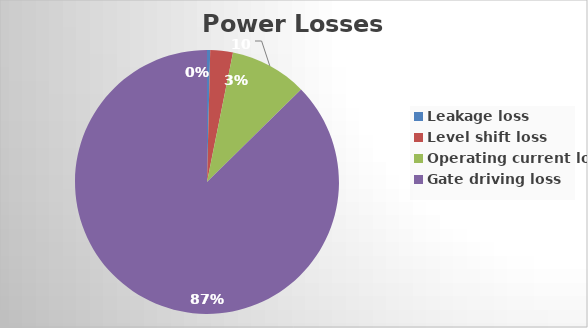
| Category | Series 0 |
|---|---|
| Leakage loss | 0.208 |
| Level shift loss | 1.485 |
| Operating current loss | 5.067 |
| Gate driving loss | 46.8 |